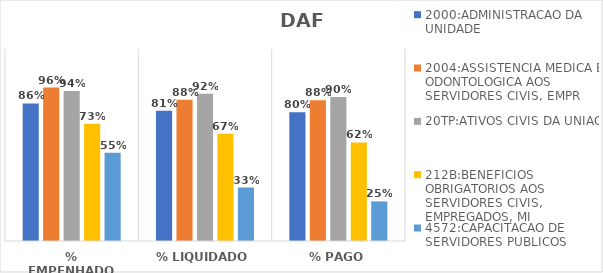
| Category | 2000:ADMINISTRACAO DA UNIDADE | 2004:ASSISTENCIA MEDICA E ODONTOLOGICA AOS SERVIDORES CIVIS, EMPR | 20TP:ATIVOS CIVIS DA UNIAO | 212B:BENEFICIOS OBRIGATORIOS AOS SERVIDORES CIVIS, EMPREGADOS, MI | 4572:CAPACITACAO DE SERVIDORES PUBLICOS FEDERAIS EM PROCESSO DE Q |
|---|---|---|---|---|---|
| % EMPENHADO | 0.86 | 0.959 | 0.938 | 0.732 | 0.551 |
| % LIQUIDADO | 0.814 | 0.883 | 0.92 | 0.671 | 0.334 |
| % PAGO | 0.805 | 0.879 | 0.9 | 0.616 | 0.248 |